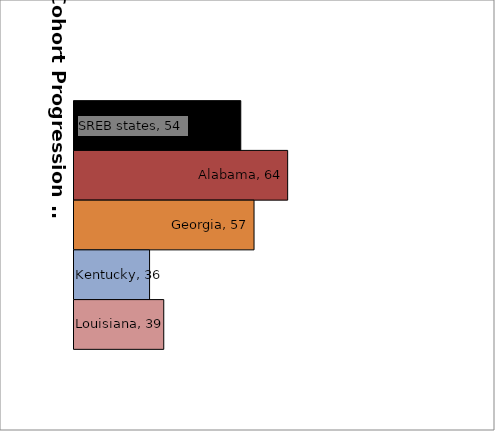
| Category | SREB states | Alabama | Georgia | Kentucky | Louisiana |
|---|---|---|---|---|---|
| 0 | 54.476 | 64.169 | 57.216 | 35.621 | 38.556 |